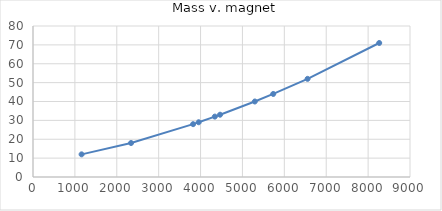
| Category | Series 0 |
|---|---|
| 1160.0 | 12 |
| 2341.0 | 18 |
| 3822.0 | 28 |
| 3955.0 | 29 |
| 4341.0 | 32 |
| 4466.0 | 33 |
| 5295.0 | 40 |
| 5735.0 | 44 |
| 6555.0 | 52 |
| 8265.0 | 71 |